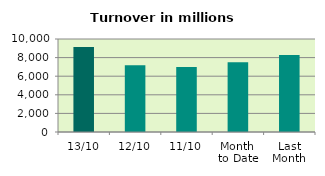
| Category | Series 0 |
|---|---|
| 13/10 | 9153.102 |
| 12/10 | 7190.421 |
| 11/10 | 6997.179 |
| Month 
to Date | 7508.476 |
| Last
Month | 8284.199 |